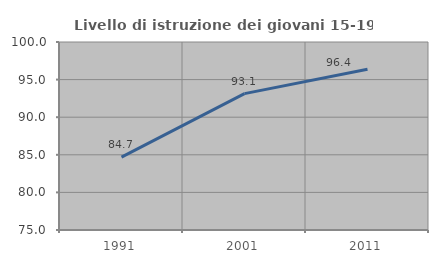
| Category | Livello di istruzione dei giovani 15-19 anni |
|---|---|
| 1991.0 | 84.683 |
| 2001.0 | 93.139 |
| 2011.0 | 96.37 |